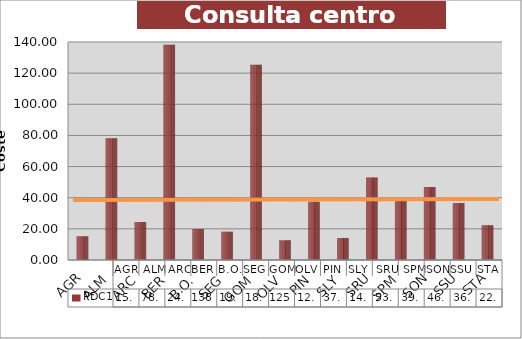
| Category | PDC1 |
|---|---|
| AGR | 15.246 |
| ALM | 78.113 |
| ARC | 24.327 |
| BER | 138.277 |
| B.O. | 19.905 |
| SEG | 18.148 |
| GOM | 125.424 |
| OLV | 12.62 |
| PIN | 37.44 |
| SLY | 14.166 |
| SRU | 53.027 |
| SPM | 39.513 |
| SON | 46.831 |
| SSU | 36.627 |
| STA | 22.35 |